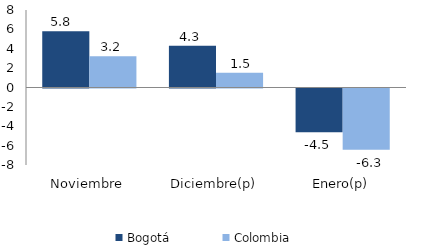
| Category | Bogotá | Colombia |
|---|---|---|
| Noviembre | 5.808 | 3.221 |
| Diciembre(p) | 4.311 | 1.535 |
| Enero(p) | -4.512 | -6.327 |